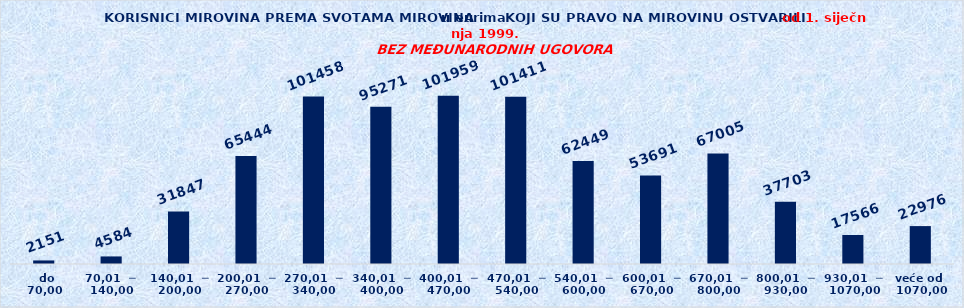
| Category | Series 0 |
|---|---|
|   do  70,00 | 2151 |
| 70,01  ─  140,00 | 4584 |
| 140,01  ─  200,00 | 31847 |
| 200,01  ─  270,00 | 65444 |
| 270,01  ─  340,00 | 101458 |
| 340,01  ─  400,00 | 95271 |
| 400,01  ─  470,00 | 101959 |
| 470,01  ─  540,00 | 101411 |
| 540,01  ─  600,00 | 62449 |
| 600,01  ─  670,00 | 53691 |
| 670,01  ─  800,00 | 67005 |
| 800,01  ─  930,00 | 37703 |
| 930,01  ─  1070,00 | 17566 |
| veće od  1070,00 | 22976 |